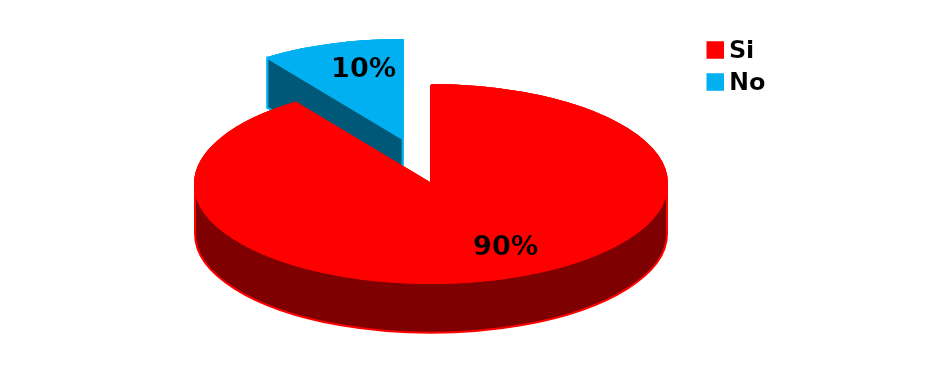
| Category | Series 0 |
|---|---|
| Si | 995 |
| No | 107 |